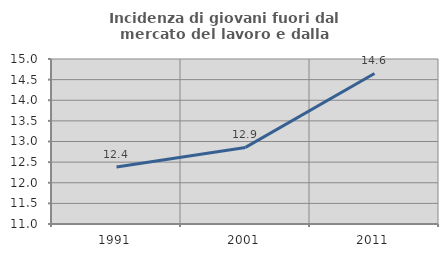
| Category | Incidenza di giovani fuori dal mercato del lavoro e dalla formazione  |
|---|---|
| 1991.0 | 12.381 |
| 2001.0 | 12.857 |
| 2011.0 | 14.65 |